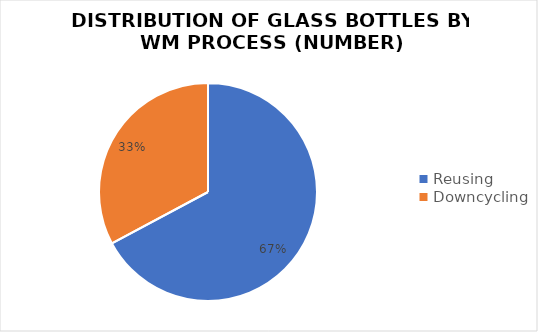
| Category | Series 0 |
|---|---|
| Reusing  | 2079 |
| Downcycling | 1016 |